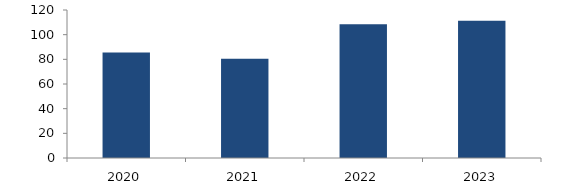
| Category | Bogotá |
|---|---|
| 2020.0 | 85.476 |
| 2021.0 | 80.566 |
| 2022.0 | 108.526 |
| 2023.0 | 111.297 |